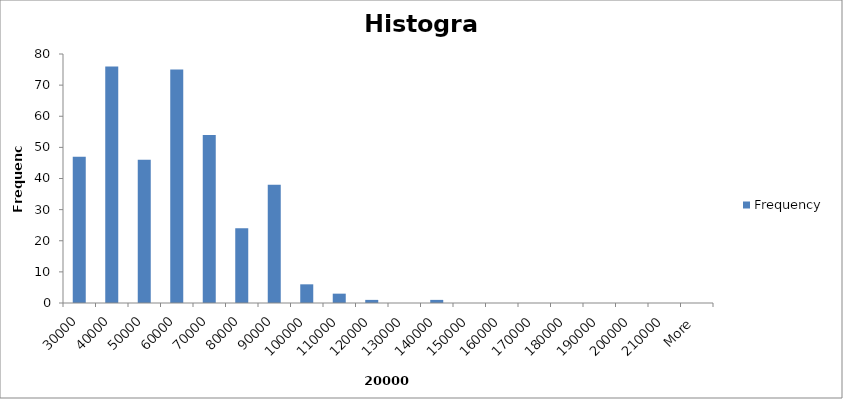
| Category | Frequency |
|---|---|
| 30000 | 47 |
| 40000 | 76 |
| 50000 | 46 |
| 60000 | 75 |
| 70000 | 54 |
| 80000 | 24 |
| 90000 | 38 |
| 100000 | 6 |
| 110000 | 3 |
| 120000 | 1 |
| 130000 | 0 |
| 140000 | 1 |
| 150000 | 0 |
| 160000 | 0 |
| 170000 | 0 |
| 180000 | 0 |
| 190000 | 0 |
| 200000 | 0 |
| 210000 | 0 |
| More | 0 |